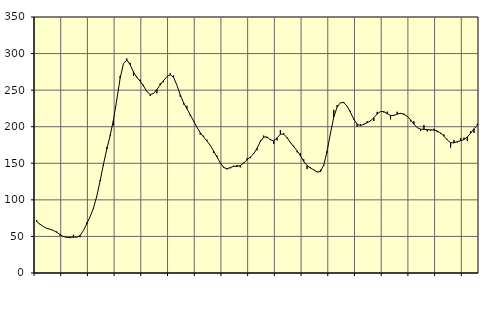
| Category | Piggar | Series 1 |
|---|---|---|
| nan | 72.2 | 70.2 |
| 87.0 | 66.4 | 66.82 |
| 87.0 | 63.4 | 63.47 |
| 87.0 | 60.5 | 61.09 |
| nan | 59.6 | 59.76 |
| 88.0 | 58 | 58.25 |
| 88.0 | 56.7 | 55.61 |
| 88.0 | 50.9 | 52.63 |
| nan | 49.6 | 49.89 |
| 89.0 | 49.3 | 48.65 |
| 89.0 | 47.6 | 48.89 |
| 89.0 | 52.2 | 49.01 |
| nan | 48.7 | 48.93 |
| 90.0 | 48.9 | 51.24 |
| 90.0 | 58 | 58.06 |
| 90.0 | 69.2 | 67.35 |
| nan | 76.8 | 76.92 |
| 91.0 | 87.7 | 88.49 |
| 91.0 | 105.3 | 104.83 |
| 91.0 | 127.1 | 125.73 |
| nan | 146.8 | 148.47 |
| 92.0 | 172 | 169.24 |
| 92.0 | 188.9 | 187.7 |
| 92.0 | 201.9 | 209.04 |
| nan | 236.8 | 237.04 |
| 93.0 | 269.5 | 266.18 |
| 93.0 | 286.3 | 286.27 |
| 93.0 | 293.3 | 291.33 |
| nan | 287.4 | 284.81 |
| 94.0 | 269.3 | 274.79 |
| 94.0 | 268.5 | 267.31 |
| 94.0 | 264.5 | 262.32 |
| nan | 257.2 | 255.71 |
| 95.0 | 247.8 | 248.13 |
| 95.0 | 242.1 | 243.94 |
| 95.0 | 245.7 | 245.47 |
| nan | 245.7 | 250.8 |
| 96.0 | 259.3 | 257.05 |
| 96.0 | 260.8 | 263.1 |
| 96.0 | 268.3 | 268.41 |
| nan | 273 | 271.07 |
| 97.0 | 270.1 | 267.63 |
| 97.0 | 256.9 | 256.92 |
| 97.0 | 241 | 243.66 |
| nan | 230.5 | 232.93 |
| 98.0 | 228.5 | 224.65 |
| 98.0 | 214.8 | 216.46 |
| 98.0 | 207.3 | 207.94 |
| nan | 199.4 | 199.22 |
| 99.0 | 189.2 | 191.87 |
| 99.0 | 187.6 | 185.97 |
| 99.0 | 182.2 | 180.61 |
| nan | 174 | 174.45 |
| 0.0 | 164.4 | 166.86 |
| 0.0 | 160.6 | 158.61 |
| 0.0 | 149.8 | 150.46 |
| nan | 145.3 | 144.3 |
| 1.0 | 141.7 | 142.51 |
| 1.0 | 143.1 | 144.13 |
| 1.0 | 146.6 | 145.79 |
| nan | 147.7 | 145.86 |
| 2.0 | 144.4 | 146.72 |
| 2.0 | 151 | 150.16 |
| 2.0 | 156.8 | 154.74 |
| nan | 157 | 158.65 |
| 3.0 | 163.5 | 162.96 |
| 3.0 | 167.7 | 170.47 |
| 3.0 | 181.1 | 179.65 |
| nan | 187.9 | 185.88 |
| 4.0 | 184.4 | 186 |
| 4.0 | 182.7 | 182.1 |
| 4.0 | 176.6 | 180.67 |
| nan | 181.3 | 184.71 |
| 5.0 | 195.4 | 189.71 |
| 5.0 | 191.3 | 189.88 |
| 5.0 | 184.1 | 185.09 |
| nan | 177.6 | 178.53 |
| 6.0 | 174 | 172.55 |
| 6.0 | 165 | 167.14 |
| 6.0 | 163.6 | 160.45 |
| nan | 155.4 | 152.64 |
| 7.0 | 142 | 146.74 |
| 7.0 | 145 | 143.57 |
| 7.0 | 141.4 | 141.03 |
| nan | 137.8 | 138.16 |
| 8.0 | 141.2 | 138.61 |
| 8.0 | 146.5 | 147.64 |
| 8.0 | 164.2 | 166.57 |
| nan | 191.5 | 190.65 |
| 9.0 | 223.1 | 213.2 |
| 9.0 | 229.6 | 226.84 |
| 9.0 | 232.9 | 232.85 |
| nan | 233.9 | 232.91 |
| 10.0 | 227.5 | 228.07 |
| 10.0 | 221.8 | 219.6 |
| 10.0 | 209.4 | 210.19 |
| nan | 199.7 | 203.49 |
| 11.0 | 203.2 | 201.55 |
| 11.0 | 202.4 | 203.4 |
| 11.0 | 207.6 | 205.46 |
| nan | 208.8 | 207.88 |
| 12.0 | 207.8 | 212.4 |
| 12.0 | 220.3 | 217.37 |
| 12.0 | 220.7 | 220.78 |
| nan | 219.6 | 220.61 |
| 13.0 | 220.6 | 217.74 |
| 13.0 | 210 | 215.42 |
| 13.0 | 216.1 | 215.36 |
| nan | 220.4 | 217.17 |
| 14.0 | 217.5 | 218.3 |
| 14.0 | 217.9 | 217.08 |
| 14.0 | 213.4 | 214.19 |
| nan | 207.3 | 209.42 |
| 15.0 | 207.4 | 203.44 |
| 15.0 | 198.4 | 198.63 |
| 15.0 | 194.3 | 196.64 |
| nan | 202.2 | 196.44 |
| 16.0 | 193.4 | 196.14 |
| 16.0 | 194.3 | 195.8 |
| 16.0 | 197.1 | 195.46 |
| nan | 192.5 | 194.08 |
| 17.0 | 190.2 | 191.39 |
| 17.0 | 189.3 | 187.09 |
| 17.0 | 182.4 | 181.89 |
| nan | 171.5 | 178.2 |
| 18.0 | 181.8 | 177.93 |
| 18.0 | 178.5 | 179.67 |
| 18.0 | 184.5 | 180.79 |
| nan | 185.1 | 182.45 |
| 19.0 | 180.3 | 185.99 |
| 19.0 | 194.1 | 191.2 |
| 19.0 | 191.6 | 197.18 |
| nan | 204 | 201.76 |